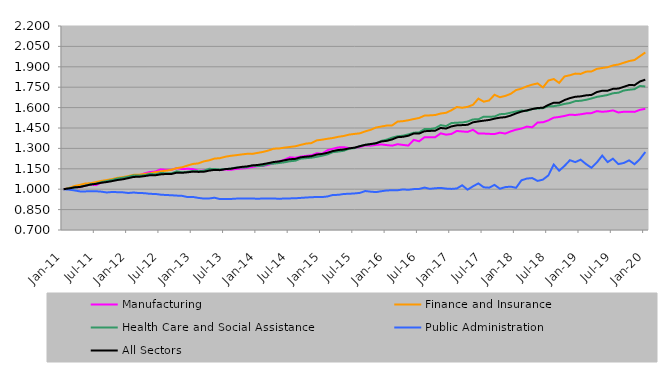
| Category | Manufacturing | Finance and Insurance | Health Care and Social Assistance | Public Administration | All Sectors |
|---|---|---|---|---|---|
| 2011-01-01 | 1 | 1 | 1 | 1 | 1 |
| 2011-02-01 | 1.006 | 1.009 | 1.006 | 0.997 | 1.006 |
| 2011-03-01 | 1.016 | 1.023 | 1.012 | 0.991 | 1.013 |
| 2011-04-01 | 1.014 | 1.032 | 1.016 | 0.984 | 1.016 |
| 2011-05-01 | 1.026 | 1.042 | 1.026 | 0.984 | 1.025 |
| 2011-06-01 | 1.034 | 1.044 | 1.036 | 0.986 | 1.034 |
| 2011-07-01 | 1.03 | 1.052 | 1.04 | 0.985 | 1.039 |
| 2011-08-01 | 1.05 | 1.061 | 1.052 | 0.982 | 1.047 |
| 2011-09-01 | 1.057 | 1.067 | 1.06 | 0.976 | 1.053 |
| 2011-10-01 | 1.065 | 1.074 | 1.068 | 0.98 | 1.06 |
| 2011-11-01 | 1.078 | 1.084 | 1.079 | 0.978 | 1.068 |
| 2011-12-01 | 1.083 | 1.089 | 1.084 | 0.977 | 1.073 |
| 2012-01-01 | 1.093 | 1.096 | 1.092 | 0.972 | 1.081 |
| 2012-02-01 | 1.098 | 1.106 | 1.102 | 0.976 | 1.09 |
| 2012-03-01 | 1.1 | 1.106 | 1.1 | 0.972 | 1.091 |
| 2012-04-01 | 1.117 | 1.112 | 1.103 | 0.971 | 1.096 |
| 2012-05-01 | 1.126 | 1.117 | 1.113 | 0.966 | 1.102 |
| 2012-06-01 | 1.13 | 1.125 | 1.109 | 0.965 | 1.102 |
| 2012-07-01 | 1.146 | 1.131 | 1.12 | 0.96 | 1.109 |
| 2012-08-01 | 1.143 | 1.136 | 1.117 | 0.957 | 1.112 |
| 2012-09-01 | 1.142 | 1.143 | 1.116 | 0.956 | 1.112 |
| 2012-10-01 | 1.155 | 1.155 | 1.131 | 0.953 | 1.122 |
| 2012-11-01 | 1.148 | 1.161 | 1.124 | 0.951 | 1.121 |
| 2012-12-01 | 1.15 | 1.174 | 1.128 | 0.942 | 1.124 |
| 2013-01-01 | 1.148 | 1.186 | 1.134 | 0.943 | 1.129 |
| 2013-02-01 | 1.136 | 1.19 | 1.133 | 0.936 | 1.127 |
| 2013-03-01 | 1.137 | 1.204 | 1.135 | 0.931 | 1.128 |
| 2013-04-01 | 1.144 | 1.212 | 1.15 | 0.932 | 1.137 |
| 2013-05-01 | 1.144 | 1.225 | 1.149 | 0.937 | 1.142 |
| 2013-06-01 | 1.14 | 1.228 | 1.145 | 0.928 | 1.14 |
| 2013-07-01 | 1.145 | 1.239 | 1.149 | 0.927 | 1.148 |
| 2013-08-01 | 1.143 | 1.245 | 1.15 | 0.928 | 1.151 |
| 2013-09-01 | 1.149 | 1.25 | 1.159 | 0.931 | 1.157 |
| 2013-10-01 | 1.152 | 1.255 | 1.159 | 0.932 | 1.164 |
| 2013-11-01 | 1.155 | 1.26 | 1.161 | 0.931 | 1.168 |
| 2013-12-01 | 1.163 | 1.26 | 1.174 | 0.932 | 1.175 |
| 2014-01-01 | 1.169 | 1.267 | 1.171 | 0.929 | 1.178 |
| 2014-02-01 | 1.171 | 1.274 | 1.172 | 0.932 | 1.184 |
| 2014-03-01 | 1.179 | 1.284 | 1.185 | 0.932 | 1.192 |
| 2014-04-01 | 1.191 | 1.298 | 1.188 | 0.932 | 1.2 |
| 2014-05-01 | 1.204 | 1.299 | 1.193 | 0.929 | 1.204 |
| 2014-06-01 | 1.217 | 1.306 | 1.198 | 0.932 | 1.213 |
| 2014-07-01 | 1.234 | 1.311 | 1.206 | 0.932 | 1.22 |
| 2014-08-01 | 1.231 | 1.316 | 1.209 | 0.933 | 1.223 |
| 2014-09-01 | 1.24 | 1.326 | 1.225 | 0.936 | 1.235 |
| 2014-10-01 | 1.245 | 1.335 | 1.228 | 0.939 | 1.239 |
| 2014-11-01 | 1.25 | 1.339 | 1.232 | 0.941 | 1.243 |
| 2014-12-01 | 1.264 | 1.359 | 1.238 | 0.943 | 1.255 |
| 2015-01-01 | 1.261 | 1.364 | 1.246 | 0.942 | 1.259 |
| 2015-02-01 | 1.287 | 1.371 | 1.256 | 0.947 | 1.268 |
| 2015-03-01 | 1.297 | 1.377 | 1.272 | 0.958 | 1.281 |
| 2015-04-01 | 1.307 | 1.385 | 1.277 | 0.958 | 1.288 |
| 2015-05-01 | 1.309 | 1.391 | 1.283 | 0.965 | 1.292 |
| 2015-06-01 | 1.302 | 1.401 | 1.298 | 0.966 | 1.3 |
| 2015-07-01 | 1.303 | 1.406 | 1.302 | 0.969 | 1.305 |
| 2015-08-01 | 1.31 | 1.411 | 1.317 | 0.973 | 1.316 |
| 2015-09-01 | 1.322 | 1.425 | 1.326 | 0.987 | 1.326 |
| 2015-10-01 | 1.32 | 1.437 | 1.33 | 0.982 | 1.332 |
| 2015-11-01 | 1.326 | 1.454 | 1.337 | 0.979 | 1.338 |
| 2015-12-01 | 1.329 | 1.461 | 1.355 | 0.985 | 1.351 |
| 2016-01-01 | 1.324 | 1.468 | 1.365 | 0.991 | 1.356 |
| 2016-02-01 | 1.32 | 1.469 | 1.379 | 0.992 | 1.366 |
| 2016-03-01 | 1.331 | 1.497 | 1.389 | 0.992 | 1.383 |
| 2016-04-01 | 1.326 | 1.5 | 1.393 | 0.998 | 1.385 |
| 2016-05-01 | 1.321 | 1.507 | 1.403 | 0.996 | 1.393 |
| 2016-06-01 | 1.363 | 1.516 | 1.415 | 1.001 | 1.409 |
| 2016-07-01 | 1.352 | 1.523 | 1.418 | 1.002 | 1.409 |
| 2016-08-01 | 1.382 | 1.541 | 1.442 | 1.012 | 1.426 |
| 2016-09-01 | 1.381 | 1.543 | 1.442 | 1.003 | 1.429 |
| 2016-10-01 | 1.383 | 1.545 | 1.449 | 1.007 | 1.43 |
| 2016-11-01 | 1.411 | 1.557 | 1.471 | 1.01 | 1.45 |
| 2016-12-01 | 1.401 | 1.562 | 1.464 | 1.004 | 1.446 |
| 2017-01-01 | 1.406 | 1.58 | 1.486 | 1.002 | 1.462 |
| 2017-02-01 | 1.428 | 1.604 | 1.489 | 1.005 | 1.469 |
| 2017-03-01 | 1.425 | 1.599 | 1.491 | 1.029 | 1.471 |
| 2017-04-01 | 1.421 | 1.606 | 1.498 | 0.996 | 1.474 |
| 2017-05-01 | 1.437 | 1.621 | 1.513 | 1.021 | 1.492 |
| 2017-06-01 | 1.409 | 1.666 | 1.514 | 1.043 | 1.498 |
| 2017-07-01 | 1.409 | 1.643 | 1.533 | 1.014 | 1.504 |
| 2017-08-01 | 1.407 | 1.652 | 1.533 | 1.011 | 1.509 |
| 2017-09-01 | 1.405 | 1.694 | 1.534 | 1.032 | 1.519 |
| 2017-10-01 | 1.416 | 1.676 | 1.551 | 1.003 | 1.526 |
| 2017-11-01 | 1.409 | 1.686 | 1.554 | 1.015 | 1.53 |
| 2017-12-01 | 1.425 | 1.701 | 1.563 | 1.019 | 1.541 |
| 2018-01-01 | 1.438 | 1.729 | 1.572 | 1.01 | 1.557 |
| 2018-02-01 | 1.446 | 1.74 | 1.579 | 1.065 | 1.571 |
| 2018-03-01 | 1.46 | 1.756 | 1.575 | 1.078 | 1.58 |
| 2018-04-01 | 1.455 | 1.769 | 1.59 | 1.082 | 1.589 |
| 2018-05-01 | 1.49 | 1.778 | 1.593 | 1.061 | 1.597 |
| 2018-06-01 | 1.492 | 1.748 | 1.596 | 1.071 | 1.599 |
| 2018-07-01 | 1.506 | 1.799 | 1.61 | 1.102 | 1.62 |
| 2018-08-01 | 1.526 | 1.81 | 1.611 | 1.181 | 1.636 |
| 2018-09-01 | 1.531 | 1.782 | 1.617 | 1.136 | 1.635 |
| 2018-10-01 | 1.539 | 1.829 | 1.627 | 1.171 | 1.656 |
| 2018-11-01 | 1.548 | 1.838 | 1.634 | 1.213 | 1.67 |
| 2018-12-01 | 1.546 | 1.85 | 1.648 | 1.199 | 1.68 |
| 2019-01-01 | 1.551 | 1.848 | 1.65 | 1.217 | 1.683 |
| 2019-02-01 | 1.558 | 1.864 | 1.657 | 1.184 | 1.69 |
| 2019-03-01 | 1.559 | 1.866 | 1.667 | 1.158 | 1.693 |
| 2019-04-01 | 1.574 | 1.885 | 1.679 | 1.196 | 1.714 |
| 2019-05-01 | 1.569 | 1.891 | 1.685 | 1.247 | 1.724 |
| 2019-06-01 | 1.573 | 1.897 | 1.693 | 1.199 | 1.724 |
| 2019-07-01 | 1.579 | 1.91 | 1.706 | 1.224 | 1.738 |
| 2019-08-01 | 1.564 | 1.917 | 1.709 | 1.185 | 1.74 |
| 2019-09-01 | 1.569 | 1.93 | 1.725 | 1.193 | 1.753 |
| 2019-10-01 | 1.57 | 1.942 | 1.731 | 1.212 | 1.766 |
| 2019-11-01 | 1.568 | 1.95 | 1.736 | 1.184 | 1.765 |
| 2019-12-01 | 1.583 | 1.978 | 1.759 | 1.221 | 1.792 |
| 2020-01-01 | 1.591 | 2.005 | 1.755 | 1.273 | 1.805 |